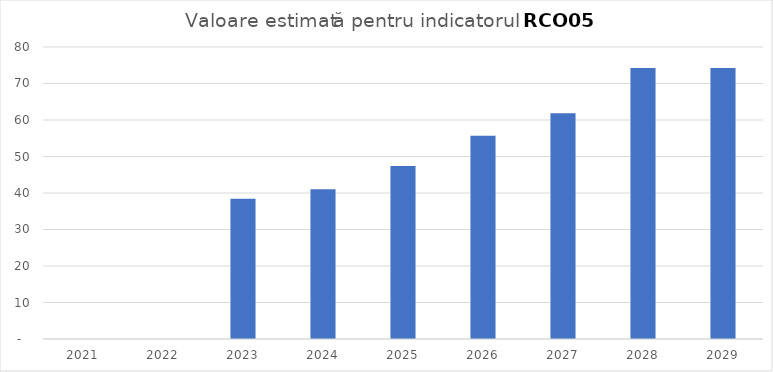
| Category | Series 0 |
|---|---|
| 2021.0 | 0 |
| 2022.0 | 0 |
| 2023.0 | 38.425 |
| 2024.0 | 41.057 |
| 2025.0 | 47.373 |
| 2026.0 | 55.664 |
| 2027.0 | 61.848 |
| 2028.0 | 74.218 |
| 2029.0 | 74.218 |